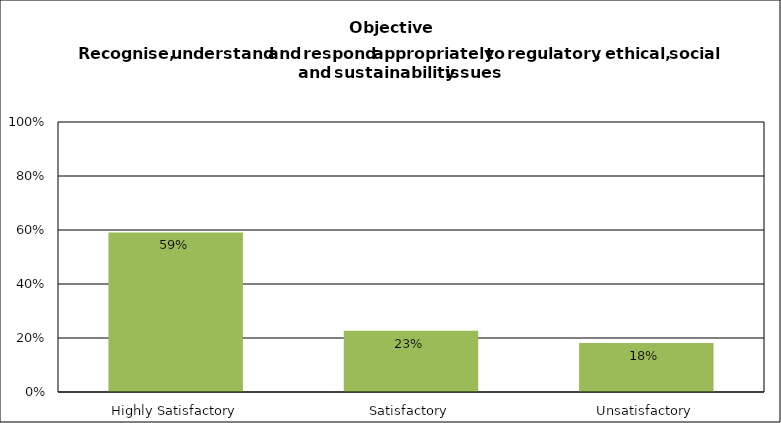
| Category | Series 2 |
|---|---|
| Highly Satisfactory | 0.591 |
| Satisfactory | 0.227 |
| Unsatisfactory | 0.182 |